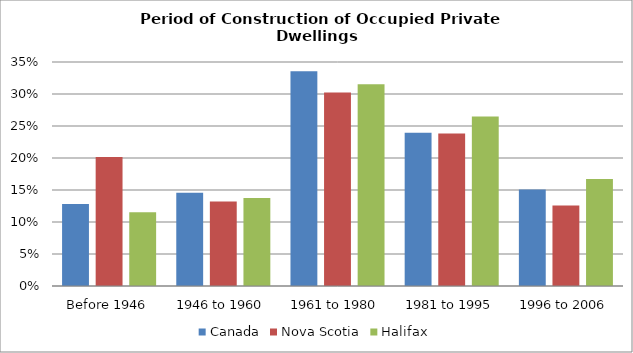
| Category | Canada | Nova Scotia | Halifax |
|---|---|---|---|
| Before 1946 | 0.128 | 0.201 | 0.115 |
| 1946 to 1960 | 0.146 | 0.132 | 0.137 |
| 1961 to 1980 | 0.336 | 0.302 | 0.315 |
| 1981 to 1995 | 0.24 | 0.238 | 0.265 |
| 1996 to 2006 | 0.151 | 0.126 | 0.167 |